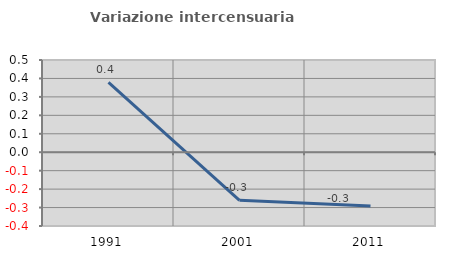
| Category | Variazione intercensuaria annua |
|---|---|
| 1991.0 | 0.379 |
| 2001.0 | -0.261 |
| 2011.0 | -0.292 |